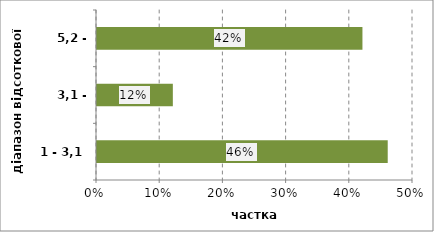
| Category | Series 0 |
|---|---|
| 1 - 3,1 | 0.46 |
| 3,1 - 5,2 | 0.12 |
| 5,2 - 7,4 | 0.42 |